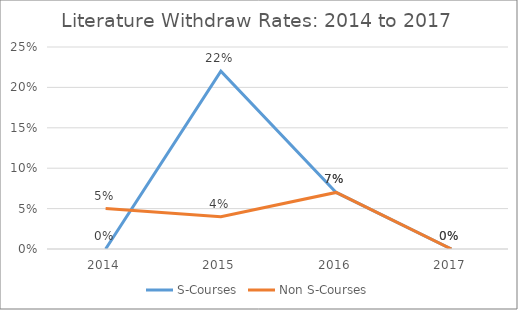
| Category | S-Courses | Non S-Courses |
|---|---|---|
| 2014.0 | 0 | 0.05 |
| 2015.0 | 0.22 | 0.04 |
| 2016.0 | 0.07 | 0.07 |
| 2017.0 | 0 | 0 |